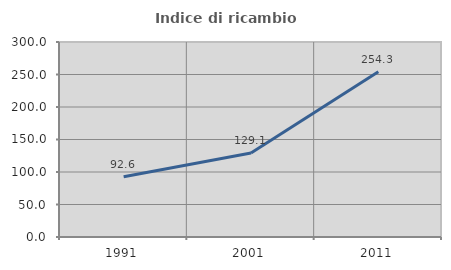
| Category | Indice di ricambio occupazionale  |
|---|---|
| 1991.0 | 92.551 |
| 2001.0 | 129.108 |
| 2011.0 | 254.342 |